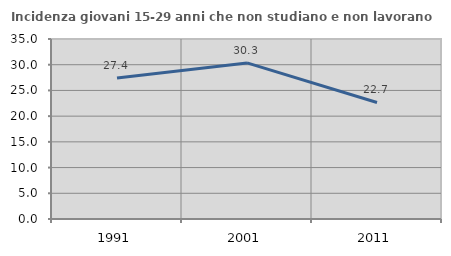
| Category | Incidenza giovani 15-29 anni che non studiano e non lavorano  |
|---|---|
| 1991.0 | 27.422 |
| 2001.0 | 30.349 |
| 2011.0 | 22.656 |